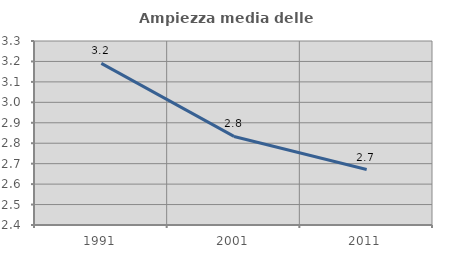
| Category | Ampiezza media delle famiglie |
|---|---|
| 1991.0 | 3.19 |
| 2001.0 | 2.833 |
| 2011.0 | 2.671 |